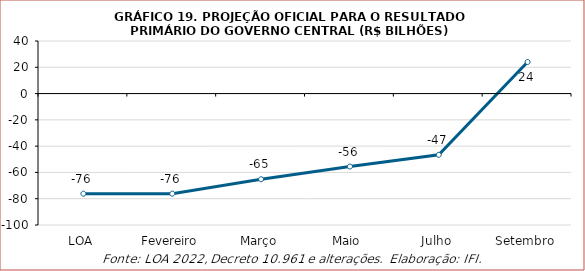
| Category | Resultado primário |
|---|---|
| LOA | -76167.2 |
| Fevereiro | -76167 |
| Março | -65183 |
| Maio | -55529 |
| Julho | -46617 |
| Setembro | 24047 |